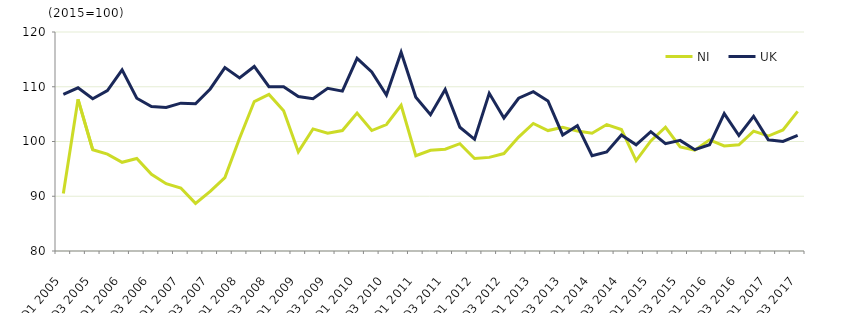
| Category | NI | UK |
|---|---|---|
| Q1 2005 | 90.5 | 108.6 |
|  | 107.7 | 109.8 |
| Q3 2005 | 98.5 | 107.8 |
|  | 97.7 | 109.3 |
| Q1 2006 | 96.2 | 113.1 |
|  | 96.9 | 107.9 |
| Q3 2006 | 94 | 106.4 |
|  | 92.3 | 106.2 |
| Q1 2007 | 91.5 | 107 |
|  | 88.7 | 106.9 |
| Q3 2007 | 90.9 | 109.6 |
|  | 93.4 | 113.5 |
| Q1 2008 | 100.6 | 111.6 |
|  | 107.3 | 113.7 |
| Q3 2008 | 108.6 | 110 |
|  | 105.6 | 110 |
| Q1 2009 | 98.1 | 108.2 |
|  | 102.3 | 107.8 |
| Q3 2009 | 101.5 | 109.7 |
|  | 102 | 109.2 |
| Q1 2010 | 105.2 | 115.2 |
|  | 102 | 112.7 |
| Q3 2010 | 103.1 | 108.5 |
|  | 106.6 | 116.3 |
| Q1 2011 | 97.4 | 108.1 |
|  | 98.4 | 104.9 |
| Q3 2011 | 98.6 | 109.5 |
|  | 99.6 | 102.6 |
| Q1 2012 | 96.9 | 100.4 |
|  | 97.1 | 108.8 |
| Q3 2012 | 97.8 | 104.3 |
|  | 100.8 | 107.9 |
| Q1 2013 | 103.3 | 109.1 |
|  | 102 | 107.4 |
| Q3 2013 | 102.6 | 101.2 |
|  | 101.9 | 102.9 |
| Q1 2014 | 101.5 | 97.4 |
|  | 103.1 | 98.1 |
| Q3 2014 | 102.2 | 101.2 |
|  | 96.5 | 99.4 |
| Q1 2015 | 100.1 | 101.8 |
|  | 102.6 | 99.6 |
| Q3 2015 | 99 | 100.2 |
|  | 98.4 | 98.5 |
| Q1 2016 | 100.3 | 99.4 |
|  | 99.2 | 105.1 |
| Q3 2016 | 99.4 | 101.1 |
|  | 101.9 | 104.6 |
| Q1 2017 | 101 | 100.3 |
|  | 102.1 | 100 |
| Q3 2017 | 105.5 | 101.1 |